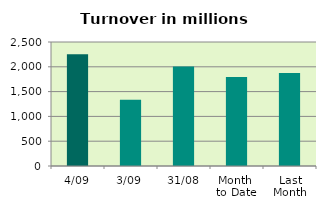
| Category | Series 0 |
|---|---|
| 4/09 | 2251.58 |
| 3/09 | 1333.337 |
| 31/08 | 2007.638 |
| Month 
to Date | 1792.459 |
| Last
Month | 1877.423 |